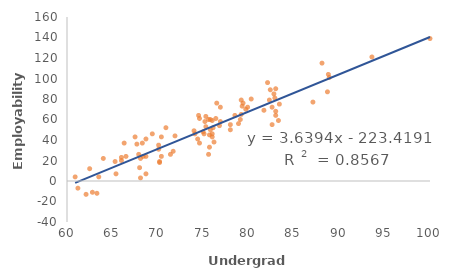
| Category | Employability Improvement |
|---|---|
| 68.4 | 24 |
| 62.1 | -13 |
| 70.2 | 18 |
| 75.1 | 46 |
| 60.9 | 4 |
| 74.5 | 64 |
| 76.4 | 61 |
| 82.6 | 55 |
| 76.9 | 72 |
| 83.3 | 59 |
| 75.8 | 50 |
| 76.0 | 46 |
| 62.8 | -11 |
| 82.8 | 85 |
| 76.0 | 59 |
| 76.9 | 58 |
| 75.8 | 60 |
| 78.0 | 50 |
| 82.4 | 89 |
| 76.2 | 38 |
| 62.5 | 12 |
| 78.0 | 55 |
| 66.5 | 24 |
| 63.5 | 4 |
| 82.6 | 72 |
| 79.2 | 65 |
| 75.0 | 48 |
| 74.4 | 41 |
| 67.9 | 26 |
| 76.8 | 54 |
| 83.0 | 64 |
| 88.9 | 101 |
| 76.5 | 76 |
| 79.9 | 72 |
| 70.4 | 24 |
| 83.4 | 75 |
| 79.2 | 79 |
| 61.2 | -7 |
| 64.0 | 22 |
| 68.0 | 13 |
| 78.5 | 64 |
| 83.0 | 90 |
| 75.2 | 58 |
| 68.1 | 22 |
| 93.6 | 121 |
| 75.6 | 26 |
| 82.3 | 79 |
| 71.4 | 26 |
| 71.9 | 44 |
| 79.1 | 60 |
| 88.7 | 87 |
| 69.4 | 46 |
| 80.3 | 80 |
| 83.0 | 68 |
| 74.1 | 46 |
| 79.4 | 76 |
| 88.1 | 115 |
| 74.6 | 37 |
| 87.1 | 77 |
| 79.7 | 70 |
| 82.1 | 96 |
| 70.2 | 19 |
| 81.7 | 69 |
| 76.1 | 52 |
| 65.4 | 7 |
| 70.1 | 31 |
| 75.3 | 63 |
| 68.7 | 24 |
| 75.7 | 33 |
| 68.7 | 41 |
| 70.4 | 43 |
| 68.3 | 37 |
| 71.7 | 29 |
| 70.9 | 52 |
| 66.3 | 37 |
| 65.3 | 19 |
| 75.7 | 45 |
| 66.0 | 23 |
| 78.9 | 56 |
| 74.0 | 49 |
| 74.6 | 61 |
| 79.3 | 73 |
| 70.1 | 35 |
| 88.8 | 104 |
| 66.0 | 20 |
| 82.9 | 81 |
| 100.0 | 139 |
| 75.6 | 60 |
| 67.5 | 43 |
| 68.7 | 7 |
| 76.0 | 43 |
| 67.7 | 36 |
| 75.3 | 53 |
| 68.1 | 3 |
| 63.3 | -12 |